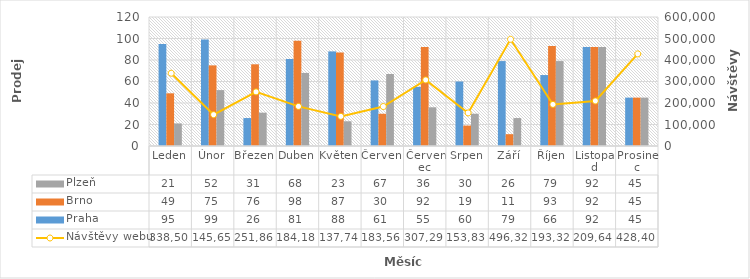
| Category | Praha | Brno | Plzeň |
|---|---|---|---|
| Leden | 95 | 49 | 21 |
| Únor | 99 | 75 | 52 |
| Březen | 26 | 76 | 31 |
| Duben | 81 | 98 | 68 |
| Květen | 88 | 87 | 23 |
| Červen | 61 | 30 | 67 |
| Červenec | 55 | 92 | 36 |
| Srpen | 60 | 19 | 30 |
| Září | 79 | 11 | 26 |
| Říjen | 66 | 93 | 79 |
| Listopad | 92 | 92 | 92 |
| Prosinec | 45 | 45 | 45 |